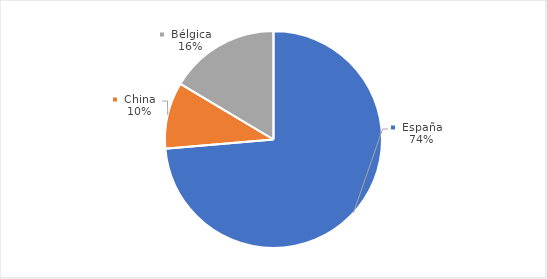
| Category | Series 0 |
|---|---|
| España | 740.837 |
| China | 99.481 |
| Bélgica | 165.449 |